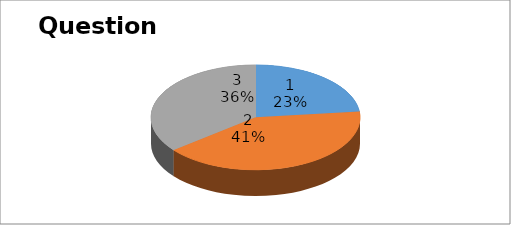
| Category | Series 0 |
|---|---|
| 0 | 13 |
| 1 | 23 |
| 2 | 20 |